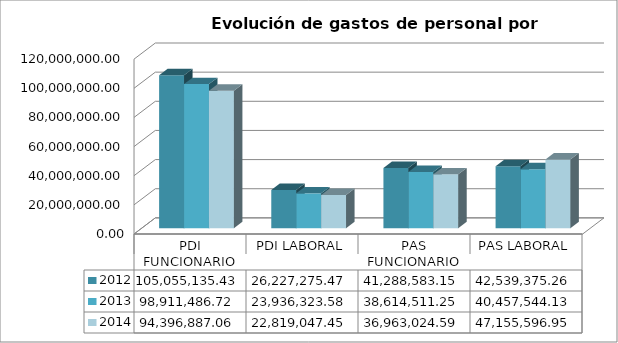
| Category | 2012 | 2013 | 2014 |
|---|---|---|---|
| PDI FUNCIONARIO | 105055135.43 | 98911486.72 | 94396887.063 |
| PDI LABORAL | 26227275.47 | 23936323.58 | 22819047.45 |
| PAS FUNCIONARIO | 41288583.15 | 38614511.25 | 36963024.586 |
| PAS LABORAL | 42539375.26 | 40457544.13 | 47155596.951 |